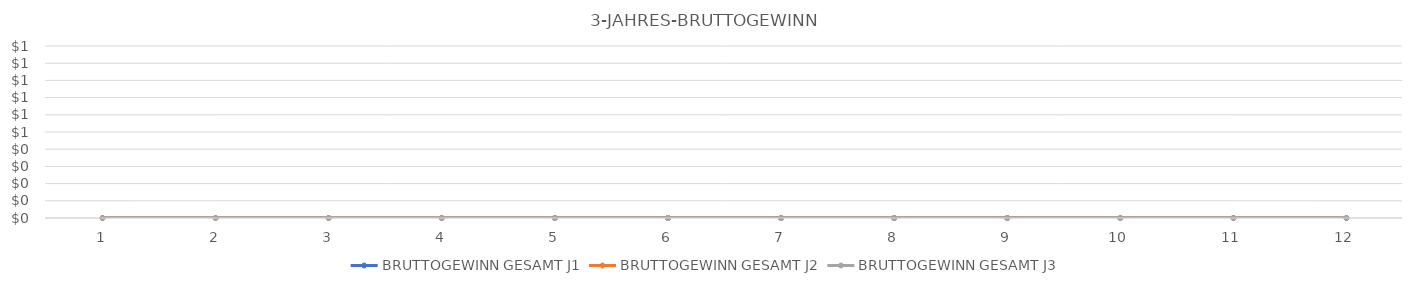
| Category | BRUTTOGEWINN GESAMT J1 | BRUTTOGEWINN GESAMT J2 | BRUTTOGEWINN GESAMT J3 |
|---|---|---|---|
| 0 | 0 | 0 | 0 |
| 1 | 0 | 0 | 0 |
| 2 | 0 | 0 | 0 |
| 3 | 0 | 0 | 0 |
| 4 | 0 | 0 | 0 |
| 5 | 0 | 0 | 0 |
| 6 | 0 | 0 | 0 |
| 7 | 0 | 0 | 0 |
| 8 | 0 | 0 | 0 |
| 9 | 0 | 0 | 0 |
| 10 | 0 | 0 | 0 |
| 11 | 0 | 0 | 0 |